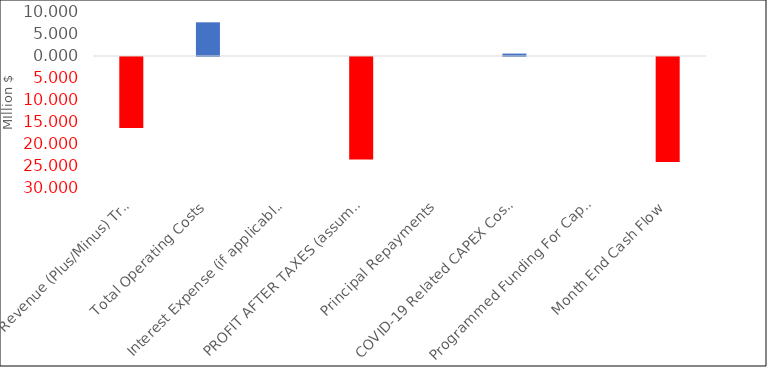
| Category | Series 0 |
|---|---|
| Total Revenue (Plus/Minus) Transfers | -16.151 |
| Total Operating Costs | 7.652 |
| Interest Expense (if applicable) | 0 |
| PROFIT AFTER TAXES (assumes cash collections) | -23.323 |
| Principal Repayments | 0 |
| COVID-19 Related CAPEX Costs | 0.55 |
| Programmed Funding For Capex | 0 |
| Month End Cash Flow | -23.873 |